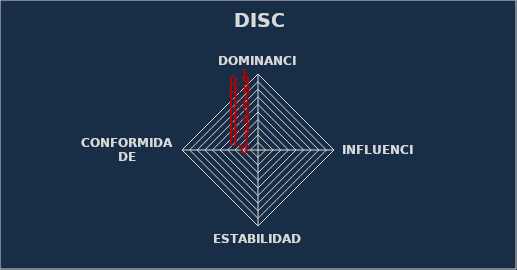
| Category | Series 0 |
|---|---|
| DOMINANCIA | 0 |
| INFLUENCIA | 0 |
| ESTABILIDADE | 0 |
| CONFORMIDADE | 0 |